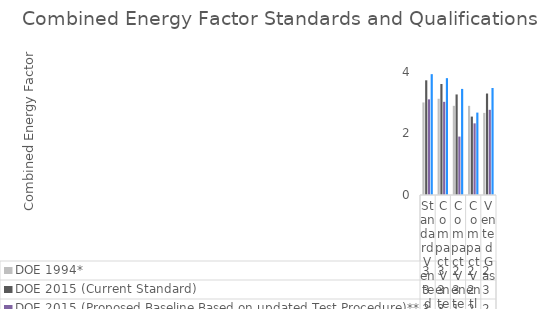
| Category | DOE 1994* | DOE 2015 (Current Standard) | DOE 2015 (Proposed Baseline Based on updated Test Procedure)** | ENERGY STAR 2015** |
|---|---|---|---|---|
| Standard Vented Electric | 3.01 | 3.73 | 3.11 | 3.93 |
| Compact Vented Electric (120V) | 3.13 | 3.61 | 3.03 | 3.8 |
| Compact Vented Electric (240V) | 2.9 | 3.27 | 1.9 | 3.45 |
| Compact Ventless Electric (240V) | 2.9 | 2.55 | 2.33 | 2.68 |
| Vented Gas | 2.67 | 3.3 | 2.77 | 3.48 |